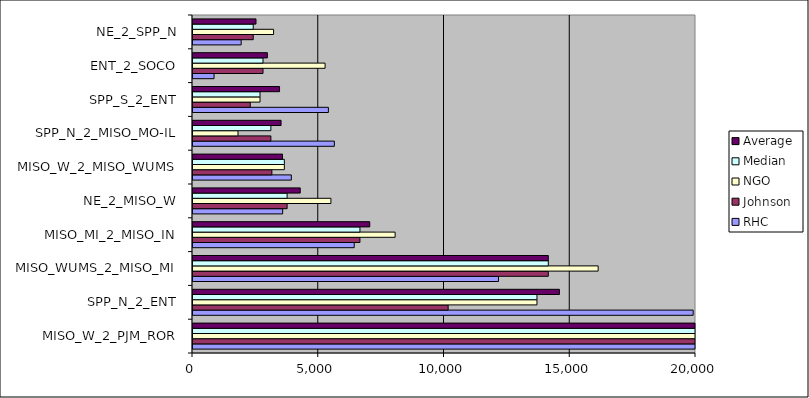
| Category | RHC | Johnson | NGO | Median | Average |
|---|---|---|---|---|---|
| MISO_W_2_PJM_ROR | 32525.425 | 20624.141 | 27546.76 | 27546.76 | 26898.776 |
| SPP_N_2_ENT | 19887.168 | 10145.249 | 13676.35 | 13676.35 | 14569.589 |
| MISO_WUMS_2_MISO_MI | 12146.032 | 14127.358 | 16109.01 | 14127.358 | 14127.467 |
| MISO_MI_2_MISO_IN | 6410.486 | 6638.156 | 8036.39 | 6638.156 | 7028.344 |
| NE_2_MISO_W | 3565.379 | 3742.239 | 5483.6 | 3742.239 | 4263.739 |
| MISO_W_2_MISO_WUMS | 3909.865 | 3136.013 | 3631.89 | 3631.89 | 3559.256 |
| SPP_N_2_MISO_MO-IL | 5620.902 | 3096.279 | 1788.85 | 3096.279 | 3502.011 |
| SPP_S_2_ENT | 5383.74 | 2275.771 | 2664.84 | 2664.84 | 3441.45 |
| ENT_2_SOCO | 836.845 | 2783.534 | 5251.94 | 2783.534 | 2957.44 |
| NE_2_SPP_N | 1915.499 | 2394.954 | 3203.82 | 2394.954 | 2504.758 |